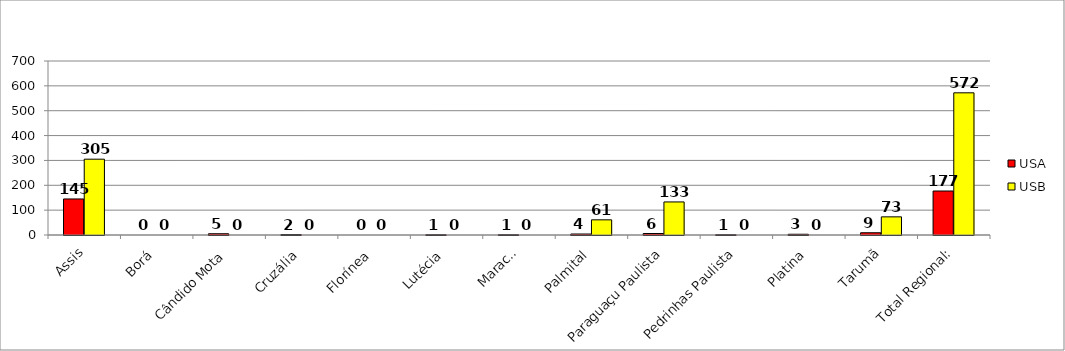
| Category | USA | USB |
|---|---|---|
| Assis | 145 | 305 |
| Borá | 0 | 0 |
| Cândido Mota | 5 | 0 |
| Cruzália | 2 | 0 |
| Florínea | 0 | 0 |
| Lutécia | 1 | 0 |
| Maracaí | 1 | 0 |
| Palmital | 4 | 61 |
| Paraguaçu Paulista | 6 | 133 |
| Pedrinhas Paulista | 1 | 0 |
| Platina | 3 | 0 |
| Tarumã | 9 | 73 |
| Total Regional: | 177 | 572 |